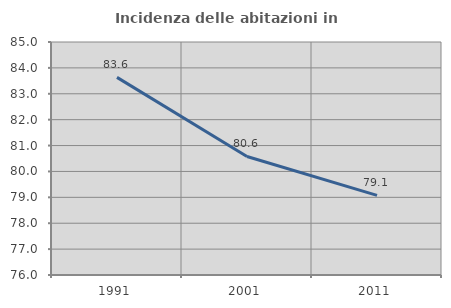
| Category | Incidenza delle abitazioni in proprietà  |
|---|---|
| 1991.0 | 83.634 |
| 2001.0 | 80.579 |
| 2011.0 | 79.077 |